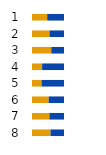
| Category | Series 0 | Series 1 | Series 2 |
|---|---|---|---|
| 0 | 47.533 |  | 52.467 |
| 1 | 54.693 |  | 45.307 |
| 2 | 60.366 |  | 39.634 |
| 3 | 31.63 |  | 68.37 |
| 4 | 29.8 |  | 70.2 |
| 5 | 52.048 |  | 47.952 |
| 6 | 54.382 |  | 45.618 |
| 7 | 57.987 |  | 42.013 |